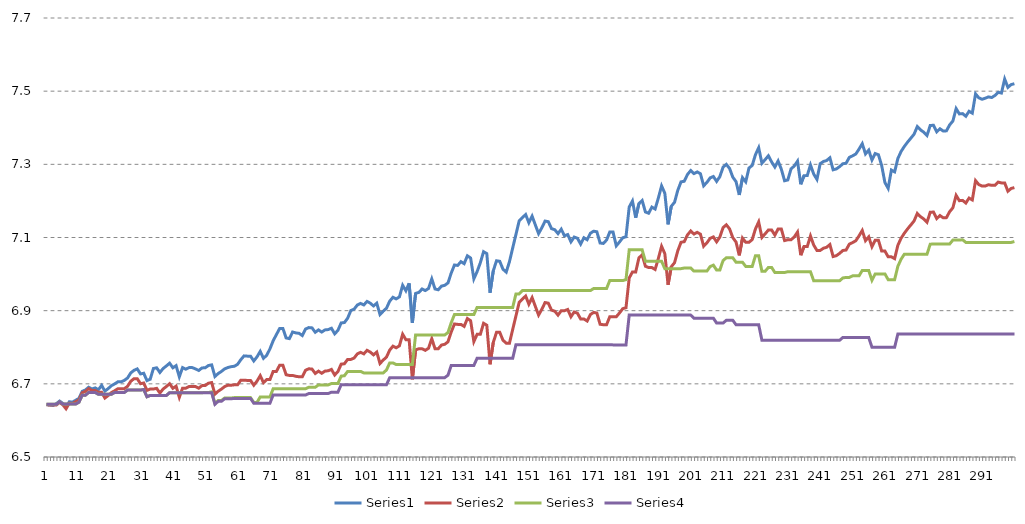
| Category | Series 0 | Series 1 | Series 2 | Series 3 |
|---|---|---|---|---|
| 0 | 6.643 | 6.643 | 6.644 | 6.644 |
| 1 | 6.642 | 6.642 | 6.644 | 6.644 |
| 2 | 6.641 | 6.642 | 6.644 | 6.644 |
| 3 | 6.646 | 6.642 | 6.644 | 6.644 |
| 4 | 6.653 | 6.649 | 6.651 | 6.651 |
| 5 | 6.647 | 6.643 | 6.645 | 6.645 |
| 6 | 6.636 | 6.632 | 6.645 | 6.645 |
| 7 | 6.651 | 6.647 | 6.645 | 6.645 |
| 8 | 6.65 | 6.646 | 6.645 | 6.645 |
| 9 | 6.655 | 6.651 | 6.645 | 6.645 |
| 10 | 6.66 | 6.657 | 6.65 | 6.65 |
| 11 | 6.68 | 6.676 | 6.669 | 6.669 |
| 12 | 6.683 | 6.679 | 6.669 | 6.669 |
| 13 | 6.691 | 6.687 | 6.676 | 6.676 |
| 14 | 6.686 | 6.682 | 6.676 | 6.676 |
| 15 | 6.689 | 6.682 | 6.676 | 6.676 |
| 16 | 6.684 | 6.677 | 6.671 | 6.671 |
| 17 | 6.696 | 6.677 | 6.671 | 6.671 |
| 18 | 6.68 | 6.661 | 6.671 | 6.671 |
| 19 | 6.687 | 6.668 | 6.671 | 6.671 |
| 20 | 6.695 | 6.676 | 6.671 | 6.671 |
| 21 | 6.7 | 6.681 | 6.676 | 6.676 |
| 22 | 6.705 | 6.687 | 6.676 | 6.676 |
| 23 | 6.705 | 6.687 | 6.676 | 6.676 |
| 24 | 6.709 | 6.687 | 6.676 | 6.676 |
| 25 | 6.716 | 6.693 | 6.683 | 6.683 |
| 26 | 6.73 | 6.707 | 6.683 | 6.683 |
| 27 | 6.737 | 6.714 | 6.683 | 6.683 |
| 28 | 6.741 | 6.714 | 6.683 | 6.683 |
| 29 | 6.727 | 6.7 | 6.683 | 6.683 |
| 30 | 6.729 | 6.702 | 6.685 | 6.685 |
| 31 | 6.709 | 6.682 | 6.665 | 6.665 |
| 32 | 6.713 | 6.686 | 6.668 | 6.668 |
| 33 | 6.742 | 6.686 | 6.668 | 6.668 |
| 34 | 6.744 | 6.688 | 6.668 | 6.668 |
| 35 | 6.731 | 6.675 | 6.668 | 6.668 |
| 36 | 6.742 | 6.686 | 6.668 | 6.668 |
| 37 | 6.749 | 6.693 | 6.668 | 6.668 |
| 38 | 6.756 | 6.7 | 6.676 | 6.676 |
| 39 | 6.744 | 6.688 | 6.676 | 6.676 |
| 40 | 6.75 | 6.694 | 6.676 | 6.676 |
| 41 | 6.719 | 6.663 | 6.676 | 6.676 |
| 42 | 6.744 | 6.688 | 6.676 | 6.676 |
| 43 | 6.74 | 6.688 | 6.676 | 6.676 |
| 44 | 6.744 | 6.692 | 6.676 | 6.676 |
| 45 | 6.744 | 6.692 | 6.676 | 6.676 |
| 46 | 6.741 | 6.692 | 6.676 | 6.676 |
| 47 | 6.736 | 6.688 | 6.676 | 6.676 |
| 48 | 6.743 | 6.695 | 6.676 | 6.676 |
| 49 | 6.744 | 6.696 | 6.676 | 6.676 |
| 50 | 6.75 | 6.702 | 6.676 | 6.676 |
| 51 | 6.752 | 6.703 | 6.678 | 6.676 |
| 52 | 6.72 | 6.672 | 6.646 | 6.644 |
| 53 | 6.728 | 6.68 | 6.654 | 6.652 |
| 54 | 6.734 | 6.686 | 6.654 | 6.652 |
| 55 | 6.741 | 6.692 | 6.661 | 6.659 |
| 56 | 6.745 | 6.696 | 6.661 | 6.659 |
| 57 | 6.747 | 6.696 | 6.661 | 6.659 |
| 58 | 6.748 | 6.697 | 6.662 | 6.66 |
| 59 | 6.753 | 6.697 | 6.662 | 6.66 |
| 60 | 6.766 | 6.71 | 6.662 | 6.66 |
| 61 | 6.776 | 6.71 | 6.662 | 6.66 |
| 62 | 6.776 | 6.709 | 6.662 | 6.66 |
| 63 | 6.776 | 6.709 | 6.662 | 6.66 |
| 64 | 6.763 | 6.696 | 6.649 | 6.647 |
| 65 | 6.774 | 6.707 | 6.649 | 6.647 |
| 66 | 6.789 | 6.722 | 6.664 | 6.647 |
| 67 | 6.77 | 6.703 | 6.664 | 6.647 |
| 68 | 6.778 | 6.712 | 6.664 | 6.647 |
| 69 | 6.796 | 6.712 | 6.664 | 6.647 |
| 70 | 6.818 | 6.734 | 6.687 | 6.669 |
| 71 | 6.835 | 6.734 | 6.687 | 6.669 |
| 72 | 6.851 | 6.751 | 6.687 | 6.669 |
| 73 | 6.851 | 6.751 | 6.687 | 6.669 |
| 74 | 6.825 | 6.725 | 6.687 | 6.669 |
| 75 | 6.824 | 6.723 | 6.687 | 6.669 |
| 76 | 6.842 | 6.723 | 6.687 | 6.669 |
| 77 | 6.839 | 6.721 | 6.687 | 6.669 |
| 78 | 6.838 | 6.719 | 6.687 | 6.669 |
| 79 | 6.832 | 6.719 | 6.687 | 6.669 |
| 80 | 6.85 | 6.737 | 6.687 | 6.669 |
| 81 | 6.854 | 6.741 | 6.691 | 6.673 |
| 82 | 6.853 | 6.74 | 6.691 | 6.673 |
| 83 | 6.841 | 6.728 | 6.691 | 6.673 |
| 84 | 6.847 | 6.735 | 6.697 | 6.673 |
| 85 | 6.842 | 6.729 | 6.697 | 6.673 |
| 86 | 6.847 | 6.735 | 6.697 | 6.673 |
| 87 | 6.848 | 6.736 | 6.697 | 6.673 |
| 88 | 6.852 | 6.739 | 6.701 | 6.677 |
| 89 | 6.837 | 6.724 | 6.701 | 6.677 |
| 90 | 6.846 | 6.734 | 6.701 | 6.677 |
| 91 | 6.866 | 6.754 | 6.721 | 6.697 |
| 92 | 6.868 | 6.755 | 6.722 | 6.697 |
| 93 | 6.879 | 6.767 | 6.734 | 6.697 |
| 94 | 6.9 | 6.767 | 6.734 | 6.697 |
| 95 | 6.904 | 6.77 | 6.734 | 6.697 |
| 96 | 6.916 | 6.782 | 6.734 | 6.697 |
| 97 | 6.92 | 6.786 | 6.734 | 6.697 |
| 98 | 6.916 | 6.782 | 6.73 | 6.697 |
| 99 | 6.925 | 6.792 | 6.73 | 6.697 |
| 100 | 6.92 | 6.787 | 6.73 | 6.697 |
| 101 | 6.913 | 6.779 | 6.73 | 6.697 |
| 102 | 6.92 | 6.787 | 6.73 | 6.697 |
| 103 | 6.889 | 6.756 | 6.73 | 6.697 |
| 104 | 6.899 | 6.765 | 6.73 | 6.697 |
| 105 | 6.907 | 6.773 | 6.738 | 6.697 |
| 106 | 6.926 | 6.792 | 6.757 | 6.717 |
| 107 | 6.937 | 6.803 | 6.757 | 6.717 |
| 108 | 6.932 | 6.799 | 6.753 | 6.717 |
| 109 | 6.938 | 6.804 | 6.753 | 6.717 |
| 110 | 6.969 | 6.836 | 6.753 | 6.717 |
| 111 | 6.954 | 6.821 | 6.753 | 6.717 |
| 112 | 6.975 | 6.821 | 6.753 | 6.717 |
| 113 | 6.866 | 6.712 | 6.753 | 6.717 |
| 114 | 6.947 | 6.793 | 6.834 | 6.717 |
| 115 | 6.95 | 6.796 | 6.834 | 6.717 |
| 116 | 6.959 | 6.796 | 6.834 | 6.717 |
| 117 | 6.955 | 6.792 | 6.834 | 6.717 |
| 118 | 6.961 | 6.797 | 6.834 | 6.717 |
| 119 | 6.987 | 6.823 | 6.834 | 6.717 |
| 120 | 6.959 | 6.796 | 6.834 | 6.717 |
| 121 | 6.957 | 6.796 | 6.834 | 6.717 |
| 122 | 6.967 | 6.806 | 6.834 | 6.717 |
| 123 | 6.969 | 6.808 | 6.834 | 6.717 |
| 124 | 6.976 | 6.815 | 6.84 | 6.724 |
| 125 | 7.003 | 6.841 | 6.867 | 6.75 |
| 126 | 7.025 | 6.864 | 6.889 | 6.75 |
| 127 | 7.024 | 6.862 | 6.889 | 6.75 |
| 128 | 7.034 | 6.862 | 6.889 | 6.75 |
| 129 | 7.028 | 6.857 | 6.889 | 6.75 |
| 130 | 7.05 | 6.879 | 6.889 | 6.75 |
| 131 | 7.044 | 6.872 | 6.889 | 6.75 |
| 132 | 6.987 | 6.816 | 6.889 | 6.75 |
| 133 | 7.007 | 6.835 | 6.909 | 6.77 |
| 134 | 7.031 | 6.835 | 6.909 | 6.77 |
| 135 | 7.061 | 6.866 | 6.909 | 6.77 |
| 136 | 7.056 | 6.86 | 6.909 | 6.77 |
| 137 | 6.949 | 6.753 | 6.909 | 6.77 |
| 138 | 7.009 | 6.813 | 6.909 | 6.77 |
| 139 | 7.036 | 6.841 | 6.909 | 6.77 |
| 140 | 7.035 | 6.841 | 6.909 | 6.77 |
| 141 | 7.013 | 6.819 | 6.909 | 6.77 |
| 142 | 7.005 | 6.811 | 6.909 | 6.77 |
| 143 | 7.034 | 6.811 | 6.909 | 6.77 |
| 144 | 7.071 | 6.849 | 6.909 | 6.77 |
| 145 | 7.108 | 6.886 | 6.946 | 6.807 |
| 146 | 7.145 | 6.923 | 6.946 | 6.807 |
| 147 | 7.154 | 6.932 | 6.955 | 6.807 |
| 148 | 7.163 | 6.94 | 6.955 | 6.807 |
| 149 | 7.14 | 6.918 | 6.955 | 6.807 |
| 150 | 7.158 | 6.936 | 6.955 | 6.807 |
| 151 | 7.134 | 6.912 | 6.955 | 6.807 |
| 152 | 7.111 | 6.888 | 6.955 | 6.807 |
| 153 | 7.127 | 6.904 | 6.955 | 6.807 |
| 154 | 7.145 | 6.922 | 6.955 | 6.807 |
| 155 | 7.143 | 6.921 | 6.955 | 6.807 |
| 156 | 7.124 | 6.901 | 6.955 | 6.807 |
| 157 | 7.121 | 6.899 | 6.955 | 6.807 |
| 158 | 7.111 | 6.888 | 6.955 | 6.807 |
| 159 | 7.123 | 6.9 | 6.955 | 6.807 |
| 160 | 7.105 | 6.9 | 6.955 | 6.807 |
| 161 | 7.108 | 6.903 | 6.955 | 6.807 |
| 162 | 7.088 | 6.883 | 6.955 | 6.807 |
| 163 | 7.101 | 6.896 | 6.955 | 6.807 |
| 164 | 7.098 | 6.893 | 6.955 | 6.807 |
| 165 | 7.082 | 6.877 | 6.955 | 6.807 |
| 166 | 7.099 | 6.877 | 6.955 | 6.807 |
| 167 | 7.094 | 6.872 | 6.955 | 6.807 |
| 168 | 7.112 | 6.889 | 6.955 | 6.807 |
| 169 | 7.117 | 6.895 | 6.961 | 6.807 |
| 170 | 7.116 | 6.894 | 6.961 | 6.807 |
| 171 | 7.085 | 6.863 | 6.961 | 6.807 |
| 172 | 7.084 | 6.862 | 6.961 | 6.807 |
| 173 | 7.093 | 6.862 | 6.961 | 6.807 |
| 174 | 7.115 | 6.884 | 6.983 | 6.807 |
| 175 | 7.115 | 6.883 | 6.982 | 6.806 |
| 176 | 7.077 | 6.883 | 6.982 | 6.806 |
| 177 | 7.088 | 6.894 | 6.982 | 6.806 |
| 178 | 7.099 | 6.905 | 6.982 | 6.806 |
| 179 | 7.102 | 6.908 | 6.985 | 6.806 |
| 180 | 7.183 | 6.989 | 7.066 | 6.888 |
| 181 | 7.2 | 7.006 | 7.066 | 6.888 |
| 182 | 7.154 | 7.006 | 7.066 | 6.888 |
| 183 | 7.193 | 7.044 | 7.066 | 6.888 |
| 184 | 7.201 | 7.053 | 7.066 | 6.888 |
| 185 | 7.17 | 7.021 | 7.035 | 6.888 |
| 186 | 7.166 | 7.018 | 7.035 | 6.888 |
| 187 | 7.183 | 7.018 | 7.035 | 6.888 |
| 188 | 7.178 | 7.013 | 7.035 | 6.888 |
| 189 | 7.208 | 7.043 | 7.035 | 6.888 |
| 190 | 7.241 | 7.076 | 7.035 | 6.888 |
| 191 | 7.221 | 7.056 | 7.015 | 6.888 |
| 192 | 7.136 | 6.971 | 7.015 | 6.888 |
| 193 | 7.185 | 7.02 | 7.015 | 6.888 |
| 194 | 7.196 | 7.031 | 7.015 | 6.888 |
| 195 | 7.229 | 7.064 | 7.015 | 6.888 |
| 196 | 7.252 | 7.087 | 7.015 | 6.888 |
| 197 | 7.254 | 7.089 | 7.017 | 6.888 |
| 198 | 7.272 | 7.107 | 7.017 | 6.888 |
| 199 | 7.283 | 7.118 | 7.017 | 6.888 |
| 200 | 7.275 | 7.109 | 7.008 | 6.88 |
| 201 | 7.279 | 7.114 | 7.008 | 6.88 |
| 202 | 7.274 | 7.109 | 7.008 | 6.88 |
| 203 | 7.241 | 7.076 | 7.008 | 6.88 |
| 204 | 7.251 | 7.085 | 7.008 | 6.88 |
| 205 | 7.263 | 7.098 | 7.021 | 6.88 |
| 206 | 7.267 | 7.102 | 7.024 | 6.88 |
| 207 | 7.253 | 7.088 | 7.011 | 6.866 |
| 208 | 7.266 | 7.101 | 7.011 | 6.866 |
| 209 | 7.292 | 7.127 | 7.037 | 6.866 |
| 210 | 7.3 | 7.135 | 7.045 | 6.874 |
| 211 | 7.289 | 7.124 | 7.045 | 6.874 |
| 212 | 7.265 | 7.1 | 7.045 | 6.874 |
| 213 | 7.253 | 7.088 | 7.032 | 6.862 |
| 214 | 7.216 | 7.051 | 7.032 | 6.862 |
| 215 | 7.264 | 7.098 | 7.032 | 6.862 |
| 216 | 7.252 | 7.087 | 7.021 | 6.862 |
| 217 | 7.29 | 7.087 | 7.021 | 6.862 |
| 218 | 7.297 | 7.094 | 7.021 | 6.862 |
| 219 | 7.326 | 7.123 | 7.05 | 6.862 |
| 220 | 7.345 | 7.143 | 7.05 | 6.862 |
| 221 | 7.303 | 7.1 | 7.008 | 6.819 |
| 222 | 7.313 | 7.11 | 7.008 | 6.819 |
| 223 | 7.323 | 7.121 | 7.018 | 6.819 |
| 224 | 7.307 | 7.121 | 7.018 | 6.819 |
| 225 | 7.293 | 7.107 | 7.004 | 6.819 |
| 226 | 7.309 | 7.123 | 7.004 | 6.819 |
| 227 | 7.287 | 7.123 | 7.004 | 6.819 |
| 228 | 7.255 | 7.092 | 7.004 | 6.819 |
| 229 | 7.257 | 7.094 | 7.006 | 6.819 |
| 230 | 7.288 | 7.094 | 7.006 | 6.819 |
| 231 | 7.295 | 7.102 | 7.006 | 6.819 |
| 232 | 7.309 | 7.115 | 7.006 | 6.819 |
| 233 | 7.245 | 7.052 | 7.006 | 6.819 |
| 234 | 7.269 | 7.075 | 7.006 | 6.819 |
| 235 | 7.269 | 7.075 | 7.006 | 6.819 |
| 236 | 7.298 | 7.104 | 7.006 | 6.819 |
| 237 | 7.274 | 7.079 | 6.982 | 6.819 |
| 238 | 7.259 | 7.065 | 6.982 | 6.819 |
| 239 | 7.302 | 7.065 | 6.982 | 6.819 |
| 240 | 7.308 | 7.071 | 6.982 | 6.819 |
| 241 | 7.31 | 7.073 | 6.982 | 6.819 |
| 242 | 7.318 | 7.081 | 6.982 | 6.819 |
| 243 | 7.285 | 7.048 | 6.982 | 6.819 |
| 244 | 7.287 | 7.05 | 6.982 | 6.819 |
| 245 | 7.294 | 7.057 | 6.982 | 6.819 |
| 246 | 7.302 | 7.064 | 6.989 | 6.827 |
| 247 | 7.303 | 7.066 | 6.991 | 6.827 |
| 248 | 7.319 | 7.082 | 6.991 | 6.827 |
| 249 | 7.323 | 7.086 | 6.995 | 6.827 |
| 250 | 7.328 | 7.091 | 6.995 | 6.827 |
| 251 | 7.342 | 7.104 | 6.995 | 6.827 |
| 252 | 7.356 | 7.119 | 7.01 | 6.827 |
| 253 | 7.328 | 7.091 | 7.01 | 6.827 |
| 254 | 7.339 | 7.102 | 7.01 | 6.827 |
| 255 | 7.312 | 7.075 | 6.983 | 6.8 |
| 256 | 7.329 | 7.092 | 7.001 | 6.8 |
| 257 | 7.326 | 7.092 | 7.001 | 6.8 |
| 258 | 7.297 | 7.063 | 7.001 | 6.8 |
| 259 | 7.25 | 7.063 | 7.001 | 6.8 |
| 260 | 7.234 | 7.047 | 6.985 | 6.8 |
| 261 | 7.284 | 7.047 | 6.985 | 6.8 |
| 262 | 7.279 | 7.042 | 6.985 | 6.8 |
| 263 | 7.316 | 7.079 | 7.021 | 6.836 |
| 264 | 7.335 | 7.098 | 7.041 | 6.836 |
| 265 | 7.349 | 7.112 | 7.054 | 6.836 |
| 266 | 7.361 | 7.124 | 7.054 | 6.836 |
| 267 | 7.371 | 7.134 | 7.054 | 6.836 |
| 268 | 7.382 | 7.145 | 7.054 | 6.836 |
| 269 | 7.403 | 7.166 | 7.054 | 6.836 |
| 270 | 7.394 | 7.157 | 7.054 | 6.836 |
| 271 | 7.388 | 7.151 | 7.054 | 6.836 |
| 272 | 7.379 | 7.142 | 7.054 | 6.836 |
| 273 | 7.406 | 7.169 | 7.082 | 6.836 |
| 274 | 7.407 | 7.17 | 7.082 | 6.836 |
| 275 | 7.389 | 7.152 | 7.082 | 6.836 |
| 276 | 7.397 | 7.16 | 7.082 | 6.836 |
| 277 | 7.391 | 7.154 | 7.082 | 6.836 |
| 278 | 7.391 | 7.154 | 7.082 | 6.836 |
| 279 | 7.408 | 7.171 | 7.082 | 6.836 |
| 280 | 7.418 | 7.181 | 7.093 | 6.836 |
| 281 | 7.452 | 7.215 | 7.093 | 6.836 |
| 282 | 7.438 | 7.201 | 7.093 | 6.836 |
| 283 | 7.439 | 7.201 | 7.094 | 6.836 |
| 284 | 7.431 | 7.194 | 7.087 | 6.836 |
| 285 | 7.445 | 7.208 | 7.087 | 6.836 |
| 286 | 7.44 | 7.203 | 7.087 | 6.836 |
| 287 | 7.493 | 7.255 | 7.087 | 6.836 |
| 288 | 7.482 | 7.245 | 7.087 | 6.836 |
| 289 | 7.478 | 7.241 | 7.087 | 6.836 |
| 290 | 7.481 | 7.241 | 7.087 | 6.836 |
| 291 | 7.484 | 7.244 | 7.087 | 6.836 |
| 292 | 7.483 | 7.243 | 7.087 | 6.836 |
| 293 | 7.488 | 7.243 | 7.087 | 6.836 |
| 294 | 7.497 | 7.251 | 7.087 | 6.836 |
| 295 | 7.495 | 7.249 | 7.087 | 6.836 |
| 296 | 7.533 | 7.249 | 7.087 | 6.836 |
| 297 | 7.51 | 7.226 | 7.087 | 6.836 |
| 298 | 7.518 | 7.234 | 7.087 | 6.836 |
| 299 | 7.52 | 7.236 | 7.089 | 6.836 |